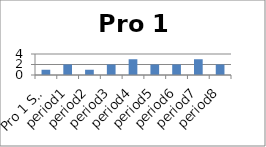
| Category | Pro 1 Sales |
|---|---|
| Pro 1 Sales | 1 |
| period1 | 2 |
| period2 | 1 |
| period3 | 2 |
| period4 | 3 |
| period5 | 2 |
| period6 | 2 |
| period7 | 3 |
| period8 | 2 |